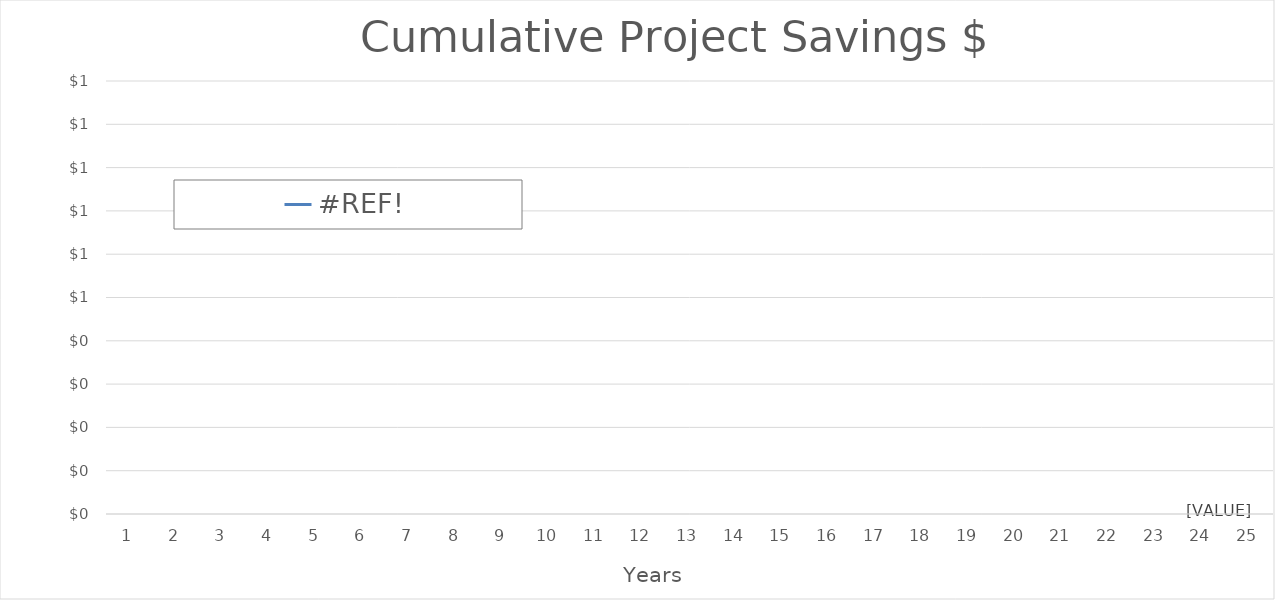
| Category | #REF! |
|---|---|
| 1.0 | 0 |
| 2.0 | 0 |
| 3.0 | 0 |
| 4.0 | 0 |
| 5.0 | 0 |
| 6.0 | 0 |
| 7.0 | 0 |
| 8.0 | 0 |
| 9.0 | 0 |
| 10.0 | 0 |
| 11.0 | 0 |
| 12.0 | 0 |
| 13.0 | 0 |
| 14.0 | 0 |
| 15.0 | 0 |
| 16.0 | 0 |
| 17.0 | 0 |
| 18.0 | 0 |
| 19.0 | 0 |
| 20.0 | 0 |
| 21.0 | 0 |
| 22.0 | 0 |
| 23.0 | 0 |
| 24.0 | 0 |
| 25.0 | 0 |